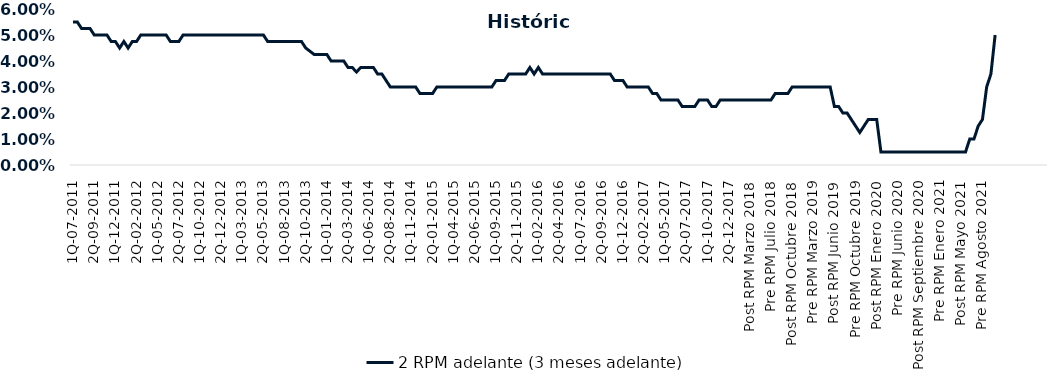
| Category | 2 RPM adelante (3 meses adelante) |
|---|---|
| 1Q-07-2011 | 0.055 |
| 2Q-07-2011 | 0.055 |
| 1Q-08-2011 | 0.052 |
| 2Q-08-2011 | 0.052 |
| 1Q-09-2011 | 0.052 |
| 2Q-09-2011 | 0.05 |
| 1Q-10-2011 | 0.05 |
| 2Q-10-2011 | 0.05 |
| 1Q-11-2011 | 0.05 |
| 2Q-11-2011 | 0.048 |
| 1Q-12-2011 | 0.048 |
| 2Q-12-2011 | 0.045 |
| 1Q-01-2012 | 0.048 |
| 2Q-01-2012 | 0.045 |
| 1Q-02-2012 | 0.048 |
| 2Q-02-2012 | 0.048 |
| 1Q-03-2012 | 0.05 |
| 2Q-03-2012 | 0.05 |
| 1Q-04-2012 | 0.05 |
| 2Q-04-2012 | 0.05 |
| 1Q-05-2012 | 0.05 |
| 2Q-05-2012 | 0.05 |
| 1Q-06-2012 | 0.05 |
| 2Q-06-2012 | 0.048 |
| 1Q-07-2012 | 0.048 |
| 2Q-07-2012 | 0.048 |
| 1Q-08-2012 | 0.05 |
| 2Q-08-2012 | 0.05 |
| 1Q-09-2012 | 0.05 |
| 2Q-09-2012 | 0.05 |
| 1Q-10-2012 | 0.05 |
| 2Q-10-2012 | 0.05 |
| 1Q-11-2012 | 0.05 |
| 2Q-11-2012 | 0.05 |
| 1Q-12-2012 | 0.05 |
| 2Q-12-2012 | 0.05 |
| 1Q-01-2013 | 0.05 |
| 2Q-01-2013 | 0.05 |
| 1Q-02-2013 | 0.05 |
| 2Q-02-2013 | 0.05 |
| 1Q-03-2013 | 0.05 |
| 2Q-03-2013 | 0.05 |
| 1Q-04-2013 | 0.05 |
| 2Q-04-2013 | 0.05 |
| 1Q-05-2013 | 0.05 |
| 2Q-05-2013 | 0.05 |
| 1Q-06-2013 | 0.048 |
| 2Q-06-2013 | 0.048 |
| 1Q-07-2013 | 0.048 |
| 2Q-07-2013 | 0.048 |
| 1Q-08-2013 | 0.048 |
| 2Q-08-2013 | 0.048 |
| 1Q-09-2013 | 0.048 |
| 2Q-09-2013 | 0.048 |
| 1Q-10-2013 | 0.048 |
| 2Q-10-2013 | 0.045 |
| 1Q-11-2013 | 0.044 |
| 2Q-11-2013 | 0.042 |
| 1Q-12-2013 | 0.042 |
| 2Q-12-2013 | 0.042 |
| 1Q-01-2014 | 0.042 |
| 2Q-01-2014 | 0.04 |
| 1Q-02-2014 | 0.04 |
| 2Q-02-2014 | 0.04 |
| 1Q-03-2014 | 0.04 |
| 2Q-03-2014 | 0.038 |
| 1Q-04-2014 | 0.038 |
| 2Q-04-2014 | 0.036 |
| 1Q-05-2014 | 0.038 |
| 2Q-05-2014 | 0.038 |
| 1Q-06-2014 | 0.038 |
| 2Q-06-2014 | 0.038 |
| 1Q-07-2014 | 0.035 |
| 2Q-07-2014 | 0.035 |
| 1Q-08-2014 | 0.032 |
| 2Q-08-2014 | 0.03 |
| 1Q-09-2014 | 0.03 |
| 2Q-09-2014 | 0.03 |
| 1Q-10-2014 | 0.03 |
| 2Q-10-2014 | 0.03 |
| 1Q-11-2014 | 0.03 |
| 2Q-11-2014 | 0.03 |
| 1Q-12-2014 | 0.028 |
| 2Q-12-2014 | 0.028 |
| 1Q-01-2015 | 0.028 |
| 2Q-01-2015 | 0.028 |
| 1Q-02-2015 | 0.03 |
| 2Q-02-2015 | 0.03 |
| 1Q-03-2015 | 0.03 |
| 2Q-03-2015 | 0.03 |
| 1Q-04-2015 | 0.03 |
| 2Q-04-2015 | 0.03 |
| 1Q-05-2015 | 0.03 |
| 2Q-05-2015 | 0.03 |
| 1Q-06-2015 | 0.03 |
| 2Q-06-2015 | 0.03 |
| 1Q-07-2015 | 0.03 |
| 2Q-07-2015 | 0.03 |
| 1Q-08-2015 | 0.03 |
| 2Q-08-2015 | 0.03 |
| 1Q-09-2015 | 0.032 |
| 2Q-09-2015 | 0.032 |
| 1Q-10-2015 | 0.032 |
| 2Q-10-2015 | 0.035 |
| 1Q-11-2015 | 0.035 |
| 2Q-11-2015 | 0.035 |
| 1Q-12-2015 | 0.035 |
| 2Q-12-2015 | 0.035 |
| 1Q-01-2016 | 0.038 |
| 2Q-01-2016 | 0.035 |
| 1Q-02-2016 | 0.038 |
| 2Q-02-2016 | 0.035 |
| 1Q-03-2016 | 0.035 |
| 2Q-03-2016 | 0.035 |
| 1Q-04-2016 | 0.035 |
| 2Q-04-2016 | 0.035 |
| 1Q-05-2016 | 0.035 |
| 2Q-05-2016 | 0.035 |
| 1Q-06-2016 | 0.035 |
| 2Q-06-2016 | 0.035 |
| 1Q-07-2016 | 0.035 |
| 2Q-07-2016 | 0.035 |
| 1Q-08-2016 | 0.035 |
| 2Q-08-2016 | 0.035 |
| 1Q-09-2016 | 0.035 |
| 2Q-09-2016 | 0.035 |
| 1Q-10-2016 | 0.035 |
| 2Q-10-2016 | 0.035 |
| 1Q-11-2016 | 0.032 |
| 2Q-11-2016 | 0.032 |
| 1Q-12-2016 | 0.032 |
| 2Q-12-2016 | 0.03 |
| 1Q-01-2017 | 0.03 |
| 2Q-01-2017 | 0.03 |
| 1Q-02-2017 | 0.03 |
| 2Q-02-2017 | 0.03 |
| 1Q-03-2017 | 0.03 |
| 2Q-03-2017 | 0.028 |
| 1Q-04-2017 | 0.028 |
| 2Q-04-2017 | 0.025 |
| 1Q-05-2017 | 0.025 |
| 2Q-05-2017 | 0.025 |
| 1Q-06-2017 | 0.025 |
| 2Q-06-2017 | 0.025 |
| 1Q-07-2017 | 0.022 |
| 2Q-07-2017 | 0.022 |
| 1Q-08-2017 | 0.022 |
| 2Q-08-2017 | 0.022 |
| 1Q-09-2017 | 0.025 |
| 2Q-09-2017 | 0.025 |
| 1Q-10-2017 | 0.025 |
| 2Q-10-2017 | 0.022 |
| 1Q-11-2017 | 0.022 |
| 2Q-11-2017 | 0.025 |
| 1Q-12-2017 | 0.025 |
| 2Q-12-2017 | 0.025 |
| 1Q-01-2018 | 0.025 |
| 2Q-01-2018 | 0.025 |
| Post RPM Febrero 2018 | 0.025 |
| Pre RPM Marzo 2018 | 0.025 |
| Post RPM Marzo 2018 | 0.025 |
| Pre RPM Mayo 2018 | 0.025 |
| Post RPM Mayo 2018 | 0.025 |
| Pre RPM Junio 2018 | 0.025 |
| Post RPM Junio 2018 | 0.025 |
| Pre RPM Julio 2018 | 0.025 |
| Post RPM Julio 2018 | 0.028 |
| Pre RPM Septiembre 2018 | 0.028 |
| Post RPM Septiembre 2018 | 0.028 |
| Pre RPM Octubre 2018 | 0.028 |
| Post RPM Octubre 2018 | 0.03 |
| Pre RPM Diciembre 2018 | 0.03 |
| Post RPM Diciembre 2018 | 0.03 |
| Pre RPM Enero 2019 | 0.03 |
| Post RPM Enero 2019 | 0.03 |
| Pre RPM Marzo 2019 | 0.03 |
| Post RPM Marzo 2019 | 0.03 |
| Pre RPM Mayo 2019 | 0.03 |
| Post RPM Mayo 2019 | 0.03 |
| Pre RPM Junio 2019 | 0.03 |
| Post RPM Junio 2019 | 0.022 |
| Pre RPM Julio 2019 | 0.022 |
| Post RPM Julio 2019 | 0.02 |
| Pre RPM Septiembre 2019 | 0.02 |
| Post RPM Septiembre 2019 | 0.018 |
| Pre RPM Octubre 2019 | 0.015 |
| Post RPM Octubre 2019 | 0.012 |
| Pre RPM Diciembre 2019 | 0.015 |
| Post RPM Diciembre 2019 | 0.018 |
| Pre RPM Enero 2020 | 0.018 |
| Post RPM Enero 2020 | 0.018 |
| Pre RPM Marzo 2020 | 0.005 |
| Post RPM Marzo 2020 | 0.005 |
| Pre RPM Mayo 2020 | 0.005 |
| Post RPM Mayo 2020 | 0.005 |
| Pre RPM Junio 2020 | 0.005 |
| Post RPM Junio 2020 | 0.005 |
| Pre RPM Julio 2020 | 0.005 |
| Post RPM Julio 2020 | 0.005 |
| Pre RPM Septiembre 2020 | 0.005 |
| Post RPM Septiembre 2020 | 0.005 |
| Pre RPM Octubre 2020 | 0.005 |
| Post RPM Octubre 2020 | 0.005 |
| Pre RPM Diciembre 2020 | 0.005 |
| Post RPM Diciembre 2020 | 0.005 |
| Pre RPM Enero 2021 | 0.005 |
| Post RPM Enero 2021 | 0.005 |
| Pre RPM Marzo 2021 | 0.005 |
| Post RPM Marzo 2021 | 0.005 |
| Pre RPM Mayo 2021 | 0.005 |
| Post RPM Mayo 2021 | 0.005 |
| Pre RPM Junio 2021 | 0.005 |
| Post RPM Junio 2021 | 0.01 |
| Pre RPM Julio 2021 | 0.01 |
| Post RPM Julio 2021 | 0.015 |
| Pre RPM Agosto 2021 | 0.018 |
| Post RPM Agosto 2021 | 0.03 |
| Pre RPM Octubre 2021 | 0.035 |
| Post RPM Octubre 2021 | 0.05 |